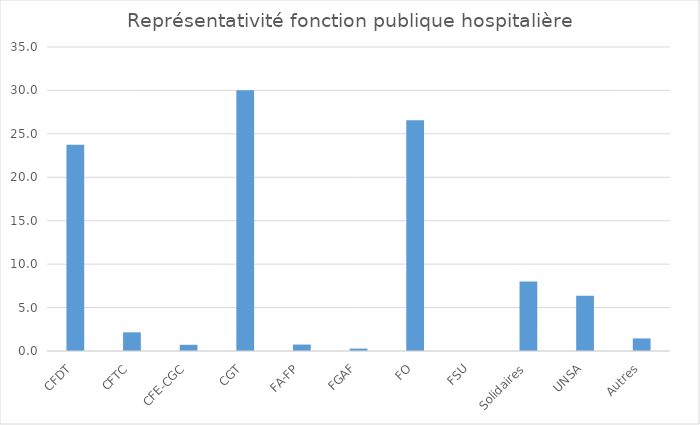
| Category | Series 0 |
|---|---|
| CFDT | 23.735 |
| CFTC | 2.149 |
| CFE-CGC | 0.714 |
| CGT | 30.032 |
| FA-FP | 0.741 |
| FGAF | 0.276 |
| FO | 26.555 |
| FSU | 0 |
| Solidaires | 8 |
| UNSA | 6.349 |
| Autres | 1.449 |